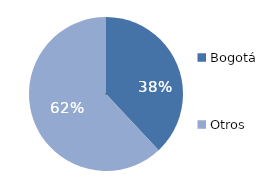
| Category | Series 0 |
|---|---|
| Bogotá | 38.033 |
| Otros | 61.967 |